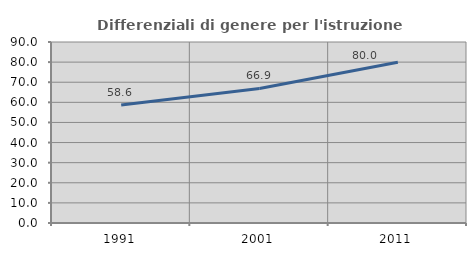
| Category | Differenziali di genere per l'istruzione superiore |
|---|---|
| 1991.0 | 58.624 |
| 2001.0 | 66.923 |
| 2011.0 | 79.955 |